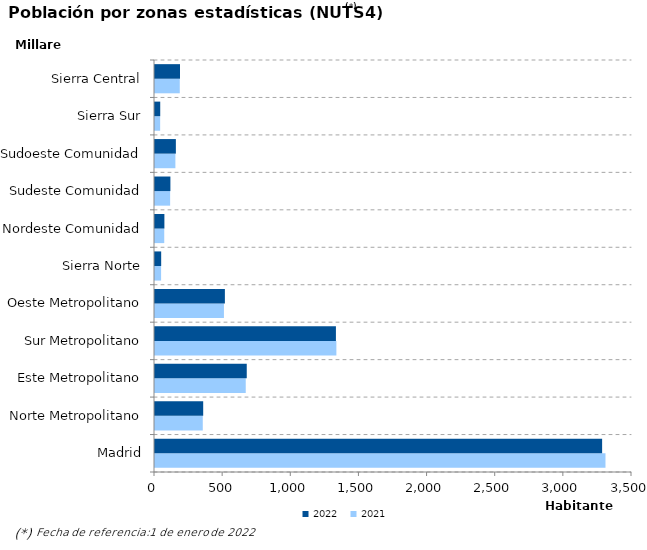
| Category | 2021 | 2022 |
|---|---|---|
| Madrid | 3305408 | 3280782 |
| Norte Metropolitano | 350513 | 353626 |
| Este Metropolitano | 665841 | 673232 |
| Sur Metropolitano | 1330864 | 1327502 |
| Oeste Metropolitano | 505757 | 512784 |
| Sierra Norte | 44750 | 45338 |
| Nordeste Comunidad | 67841 | 68932 |
| Sudeste Comunidad | 111048 | 113040 |
| Sudoeste Comunidad | 149640 | 153084 |
| Sierra Sur | 37846 | 38370 |
| Sierra Central | 181743 | 183646 |